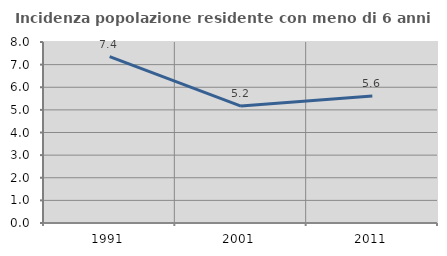
| Category | Incidenza popolazione residente con meno di 6 anni |
|---|---|
| 1991.0 | 7.352 |
| 2001.0 | 5.168 |
| 2011.0 | 5.613 |